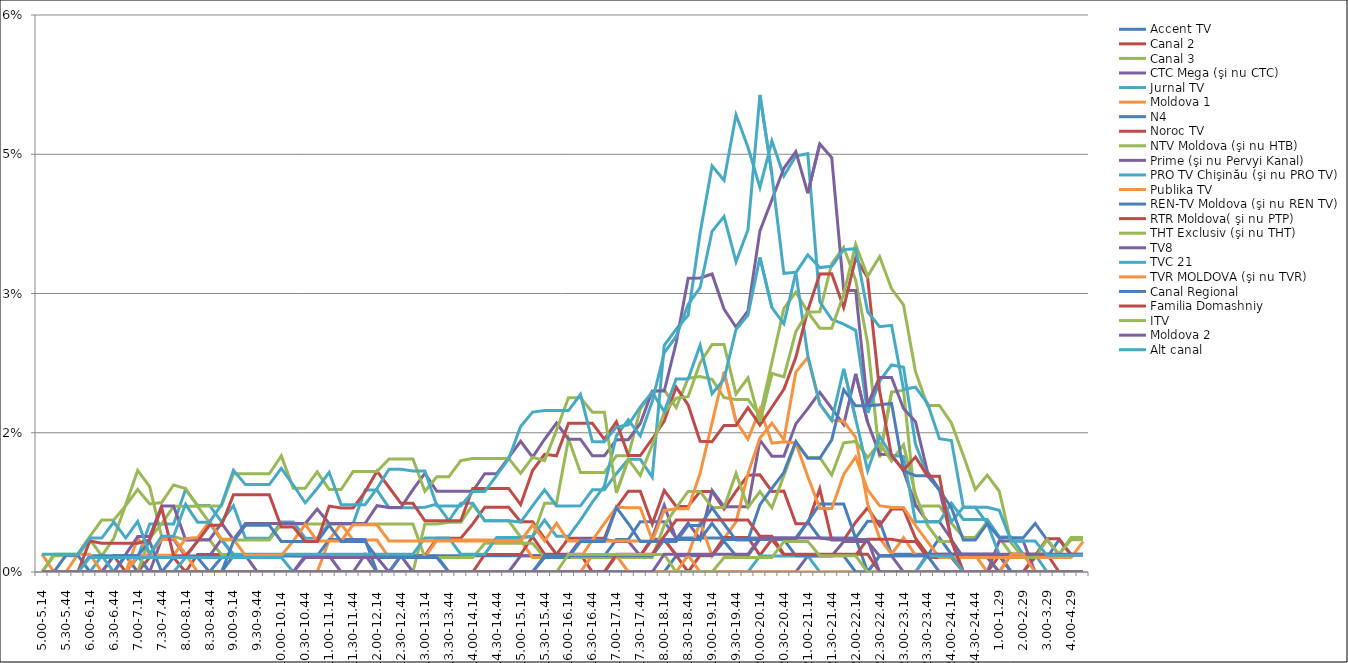
| Category | Accent TV | Canal 2 | Canal 3 | CTC Mega (şi nu CTC) | Jurnal TV | Moldova 1 | N4 | Noroc TV | NTV Moldova (şi nu HTB) | Prime (şi nu Pervyi Kanal) | PRO TV Chişinău (şi nu PRO TV) | Publika TV  | REN-TV Moldova (şi nu REN TV)  | RTR Moldova( şi nu PTP)  | THT Exclusiv (şi nu THT) | TV8 | TVC 21 | TVR MOLDOVA (şi nu TVR) | Canal Regional | Familia Domashniy | ITV | Moldova 2 | Alt canal |
|---|---|---|---|---|---|---|---|---|---|---|---|---|---|---|---|---|---|---|---|---|---|---|---|
| 5.00-5.14 | 0 | 0 | 0 | 0 | 0 | 0 | 0 | 0 | 0 | 0 | 0 | 0.002 | 0 | 0 | 0 | 0 | 0 | 0 | 0 | 0 | 0 | 0 | 0.002 |
| 5.15-5.29 | 0 | 0 | 0.002 | 0 | 0 | 0 | 0 | 0 | 0 | 0 | 0 | 0 | 0 | 0 | 0.002 | 0 | 0 | 0 | 0 | 0 | 0 | 0 | 0.002 |
| 5.30-5.44 | 0 | 0 | 0.002 | 0 | 0 | 0 | 0 | 0 | 0 | 0 | 0 | 0 | 0.002 | 0 | 0.002 | 0 | 0 | 0 | 0 | 0 | 0 | 0 | 0.002 |
| 5.45-5.59 | 0 | 0 | 0.002 | 0 | 0 | 0 | 0 | 0 | 0 | 0 | 0 | 0.002 | 0.002 | 0 | 0.002 | 0 | 0 | 0 | 0 | 0 | 0 | 0 | 0.002 |
| 6.00-6.14 | 0 | 0 | 0.003 | 0 | 0 | 0 | 0.002 | 0 | 0 | 0 | 0 | 0.002 | 0 | 0.003 | 0.004 | 0 | 0.002 | 0 | 0 | 0 | 0 | 0 | 0.004 |
| 6.15-6.29 | 0 | 0 | 0.002 | 0 | 0.002 | 0 | 0.002 | 0 | 0 | 0 | 0 | 0 | 0 | 0.003 | 0.006 | 0 | 0.002 | 0 | 0 | 0 | 0 | 0 | 0.004 |
| 6.30-6.44 | 0 | 0.002 | 0.004 | 0.002 | 0 | 0 | 0.002 | 0 | 0 | 0 | 0 | 0 | 0 | 0.003 | 0.006 | 0 | 0.002 | 0 | 0 | 0 | 0 | 0 | 0.005 |
| 6.45-6.59 | 0 | 0 | 0.007 | 0.002 | 0 | 0 | 0.002 | 0 | 0 | 0.002 | 0 | 0 | 0.002 | 0.003 | 0.007 | 0 | 0.002 | 0 | 0 | 0 | 0 | 0 | 0.004 |
| 7.00-7.14 | 0 | 0 | 0.011 | 0 | 0.002 | 0.004 | 0.002 | 0 | 0 | 0.004 | 0 | 0.002 | 0.002 | 0.003 | 0.009 | 0 | 0.002 | 0 | 0 | 0 | 0 | 0 | 0.005 |
| 7.15-7.29 | 0 | 0.002 | 0.009 | 0 | 0.005 | 0.002 | 0 | 0 | 0.004 | 0.004 | 0 | 0.002 | 0.003 | 0.003 | 0.007 | 0 | 0.002 | 0 | 0 | 0 | 0 | 0 | 0.002 |
| 7.30-7.44 | 0 | 0.002 | 0.004 | 0.004 | 0.005 | 0.003 | 0 | 0 | 0.005 | 0.007 | 0 | 0.002 | 0 | 0.007 | 0.007 | 0 | 0.002 | 0 | 0 | 0 | 0 | 0 | 0.004 |
| 7.45-7.59 | 0 | 0.002 | 0.004 | 0.004 | 0.005 | 0.004 | 0 | 0 | 0.007 | 0.007 | 0 | 0.002 | 0.002 | 0.002 | 0.009 | 0 | 0.002 | 0 | 0 | 0 | 0 | 0 | 0.004 |
| 8.00-8.14 | 0 | 0 | 0.003 | 0.002 | 0.009 | 0.002 | 0 | 0 | 0.007 | 0.003 | 0.002 | 0.004 | 0.002 | 0.002 | 0.009 | 0 | 0.002 | 0 | 0 | 0 | 0 | 0 | 0.007 |
| 8.15-8.29 | 0 | 0.002 | 0.003 | 0.002 | 0.007 | 0 | 0 | 0 | 0.007 | 0.003 | 0.003 | 0.004 | 0.002 | 0.003 | 0.007 | 0 | 0.002 | 0 | 0 | 0 | 0 | 0 | 0.005 |
| 8.30-8.44 | 0 | 0.002 | 0.003 | 0.002 | 0.007 | 0 | 0 | 0 | 0.005 | 0.003 | 0.005 | 0.005 | 0 | 0.005 | 0.007 | 0 | 0.002 | 0 | 0 | 0 | 0 | 0 | 0.005 |
| 8.45-8.59 | 0 | 0.002 | 0.002 | 0.004 | 0.005 | 0 | 0.002 | 0 | 0.003 | 0.005 | 0.003 | 0.004 | 0 | 0.005 | 0.007 | 0 | 0.002 | 0 | 0 | 0 | 0 | 0 | 0.007 |
| 9.00-9.14 | 0.002 | 0.002 | 0.002 | 0.002 | 0.007 | 0 | 0.002 | 0 | 0.003 | 0.003 | 0.002 | 0.004 | 0.003 | 0.008 | 0.011 | 0 | 0.002 | 0 | 0 | 0 | 0 | 0 | 0.011 |
| 9.15-9.29 | 0.002 | 0.002 | 0.002 | 0.002 | 0.004 | 0 | 0.002 | 0 | 0.003 | 0.005 | 0.002 | 0.002 | 0.005 | 0.008 | 0.011 | 0 | 0.002 | 0 | 0 | 0 | 0 | 0 | 0.009 |
| 9.30-9.44 | 0.002 | 0.002 | 0.002 | 0 | 0.004 | 0 | 0.002 | 0 | 0.003 | 0.005 | 0.002 | 0.002 | 0.005 | 0.008 | 0.011 | 0 | 0.002 | 0 | 0 | 0 | 0 | 0 | 0.009 |
| 9.45-9.59 | 0.002 | 0.002 | 0.002 | 0 | 0.004 | 0 | 0.002 | 0 | 0.003 | 0.005 | 0.002 | 0.002 | 0.005 | 0.008 | 0.011 | 0 | 0.002 | 0 | 0 | 0 | 0 | 0 | 0.009 |
| 10.00-10.14 | 0.002 | 0.002 | 0.002 | 0 | 0.005 | 0 | 0.002 | 0 | 0.005 | 0.005 | 0.002 | 0.002 | 0.003 | 0.005 | 0.013 | 0 | 0.002 | 0 | 0 | 0 | 0 | 0 | 0.011 |
| 10.15-10.29 | 0.002 | 0.002 | 0.002 | 0 | 0.005 | 0 | 0.002 | 0 | 0.005 | 0.005 | 0.002 | 0.003 | 0.003 | 0.005 | 0.009 | 0 | 0 | 0 | 0 | 0 | 0 | 0 | 0.009 |
| 10.30-10.44 | 0.002 | 0.002 | 0.002 | 0.002 | 0.004 | 0 | 0.002 | 0 | 0.005 | 0.005 | 0.002 | 0.005 | 0.003 | 0.003 | 0.009 | 0.002 | 0 | 0 | 0 | 0 | 0 | 0 | 0.007 |
| 10.45-10.59 | 0.002 | 0.002 | 0.002 | 0.002 | 0.004 | 0 | 0.002 | 0 | 0.005 | 0.007 | 0.002 | 0.003 | 0.003 | 0.003 | 0.011 | 0.002 | 0 | 0 | 0 | 0 | 0 | 0 | 0.009 |
| 11.00-11.14 | 0.002 | 0.002 | 0.002 | 0.002 | 0.005 | 0.003 | 0.003 | 0 | 0.005 | 0.005 | 0.002 | 0.003 | 0.005 | 0.007 | 0.009 | 0.002 | 0 | 0 | 0 | 0 | 0 | 0 | 0.011 |
| 11.15-11.29 | 0.002 | 0.002 | 0.002 | 0 | 0.005 | 0.005 | 0.003 | 0 | 0.005 | 0.005 | 0.002 | 0.003 | 0.003 | 0.007 | 0.009 | 0.002 | 0 | 0 | 0 | 0 | 0 | 0 | 0.007 |
| 11.30-11.44 | 0.002 | 0.002 | 0.002 | 0 | 0.005 | 0.003 | 0.003 | 0 | 0.005 | 0.005 | 0.002 | 0.005 | 0.003 | 0.007 | 0.011 | 0.002 | 0 | 0 | 0 | 0 | 0 | 0 | 0.007 |
| 11.45-11.59 | 0.002 | 0.002 | 0.002 | 0.002 | 0.009 | 0.003 | 0.003 | 0 | 0.005 | 0.005 | 0.002 | 0.005 | 0.003 | 0.009 | 0.011 | 0.002 | 0 | 0 | 0 | 0 | 0 | 0 | 0.007 |
| 12.00-12.14 | 0.002 | 0.002 | 0 | 0 | 0.009 | 0.003 | 0 | 0 | 0.005 | 0.007 | 0.002 | 0.005 | 0.002 | 0.011 | 0.011 | 0.002 | 0 | 0 | 0 | 0 | 0 | 0 | 0.009 |
| 12.15-12.29 | 0.002 | 0.002 | 0 | 0 | 0.007 | 0.002 | 0 | 0 | 0.005 | 0.007 | 0.002 | 0.003 | 0.002 | 0.009 | 0.012 | 0 | 0 | 0 | 0 | 0 | 0 | 0 | 0.011 |
| 12.30-12.44 | 0.002 | 0.002 | 0 | 0.002 | 0.007 | 0.002 | 0.002 | 0 | 0.005 | 0.007 | 0.002 | 0.003 | 0.002 | 0.007 | 0.012 | 0 | 0 | 0 | 0 | 0 | 0 | 0 | 0.011 |
| 12.45-12.59 | 0.002 | 0.002 | 0 | 0 | 0.007 | 0.002 | 0.002 | 0 | 0.005 | 0.009 | 0.002 | 0.003 | 0.002 | 0.007 | 0.012 | 0 | 0 | 0 | 0 | 0 | 0 | 0 | 0.011 |
| 13.00-13.14 | 0.002 | 0.002 | 0.005 | 0 | 0.007 | 0.002 | 0.002 | 0 | 0.002 | 0.011 | 0.004 | 0.003 | 0.002 | 0.006 | 0.009 | 0 | 0 | 0 | 0 | 0 | 0 | 0 | 0.011 |
| 13.15-13.29 | 0.002 | 0.004 | 0.005 | 0 | 0.007 | 0.003 | 0.002 | 0 | 0.002 | 0.009 | 0.004 | 0.003 | 0.002 | 0.006 | 0.01 | 0 | 0 | 0 | 0 | 0 | 0 | 0 | 0.007 |
| 13.30-13.44 | 0.002 | 0.004 | 0.005 | 0 | 0.006 | 0.003 | 0 | 0 | 0.002 | 0.009 | 0.004 | 0.003 | 0 | 0.006 | 0.01 | 0 | 0 | 0 | 0 | 0 | 0 | 0 | 0.007 |
| 13.45-13.59 | 0.002 | 0.004 | 0.005 | 0 | 0.007 | 0.003 | 0 | 0 | 0.002 | 0.009 | 0.002 | 0.003 | 0 | 0.006 | 0.012 | 0 | 0 | 0 | 0 | 0 | 0 | 0 | 0.007 |
| 14.00-14.14 | 0.002 | 0.005 | 0.007 | 0 | 0.007 | 0.003 | 0 | 0 | 0.002 | 0.009 | 0.002 | 0.003 | 0 | 0.009 | 0.012 | 0 | 0 | 0 | 0 | 0 | 0 | 0 | 0.009 |
| 14.15-14.29 | 0.002 | 0.007 | 0.006 | 0 | 0.006 | 0.003 | 0 | 0.002 | 0.003 | 0.011 | 0.002 | 0.003 | 0 | 0.009 | 0.012 | 0 | 0 | 0 | 0 | 0 | 0 | 0 | 0.009 |
| 14.30-14.44 | 0.002 | 0.007 | 0.006 | 0 | 0.006 | 0.003 | 0 | 0.002 | 0.003 | 0.011 | 0.004 | 0.003 | 0 | 0.009 | 0.012 | 0 | 0 | 0 | 0 | 0 | 0 | 0 | 0.01 |
| 14.45-14.59 | 0.002 | 0.007 | 0.006 | 0 | 0.006 | 0.003 | 0 | 0.002 | 0.003 | 0.012 | 0.004 | 0.003 | 0 | 0.009 | 0.012 | 0 | 0 | 0 | 0 | 0 | 0 | 0 | 0.012 |
| 15.00-15.14 | 0.002 | 0.005 | 0.004 | 0.002 | 0.005 | 0.003 | 0 | 0.002 | 0.003 | 0.014 | 0.004 | 0.003 | 0 | 0.007 | 0.011 | 0 | 0 | 0 | 0 | 0 | 0 | 0 | 0.016 |
| 15.15-15.29 | 0.002 | 0.005 | 0.004 | 0.002 | 0.007 | 0.002 | 0 | 0.004 | 0.003 | 0.012 | 0.004 | 0.005 | 0 | 0.011 | 0.012 | 0 | 0 | 0 | 0 | 0 | 0 | 0 | 0.017 |
| 15.30-15.44 | 0.002 | 0.004 | 0.007 | 0.002 | 0.009 | 0.002 | 0 | 0.002 | 0.002 | 0.014 | 0.006 | 0.003 | 0.002 | 0.013 | 0.012 | 0 | 0 | 0 | 0.002 | 0 | 0 | 0 | 0.017 |
| 15.45-15.59 | 0.002 | 0.002 | 0.007 | 0.002 | 0.007 | 0.002 | 0 | 0.002 | 0.002 | 0.016 | 0.004 | 0.005 | 0.002 | 0.013 | 0.015 | 0 | 0 | 0 | 0.002 | 0 | 0 | 0 | 0.017 |
| 16.00-16.14 | 0.002 | 0.004 | 0.014 | 0.002 | 0.007 | 0.002 | 0 | 0.002 | 0.002 | 0.014 | 0.004 | 0.003 | 0.002 | 0.016 | 0.019 | 0 | 0 | 0 | 0.002 | 0 | 0.002 | 0 | 0.017 |
| 16.15-16.29 | 0.002 | 0.004 | 0.011 | 0.003 | 0.007 | 0.002 | 0 | 0.002 | 0.002 | 0.014 | 0.006 | 0.003 | 0.003 | 0.016 | 0.019 | 0 | 0 | 0 | 0.002 | 0 | 0.002 | 0 | 0.019 |
| 16.30-16.44 | 0.002 | 0.004 | 0.011 | 0.003 | 0.009 | 0.003 | 0 | 0 | 0.002 | 0.013 | 0.008 | 0.003 | 0.003 | 0.016 | 0.017 | 0 | 0 | 0.002 | 0.002 | 0 | 0.002 | 0 | 0.014 |
| 16.45-16.59 | 0.002 | 0.004 | 0.011 | 0.003 | 0.009 | 0.005 | 0 | 0 | 0.002 | 0.013 | 0.009 | 0.003 | 0.003 | 0.014 | 0.017 | 0 | 0 | 0.002 | 0.002 | 0 | 0.002 | 0 | 0.014 |
| 17.00-17.14 | 0.003 | 0.007 | 0.013 | 0.003 | 0.011 | 0.007 | 0 | 0.002 | 0.002 | 0.014 | 0.015 | 0.003 | 0.007 | 0.016 | 0.009 | 0 | 0 | 0.002 | 0.002 | 0.002 | 0.002 | 0 | 0.016 |
| 17.15-17.29 | 0.003 | 0.009 | 0.013 | 0.003 | 0.012 | 0.007 | 0 | 0.002 | 0.002 | 0.014 | 0.016 | 0.003 | 0.005 | 0.013 | 0.012 | 0 | 0 | 0 | 0.002 | 0.002 | 0.002 | 0 | 0.016 |
| 17.30-17.44 | 0.005 | 0.009 | 0.018 | 0.002 | 0.012 | 0.007 | 0 | 0.002 | 0.002 | 0.016 | 0.015 | 0.003 | 0.003 | 0.013 | 0.01 | 0 | 0 | 0 | 0.002 | 0.002 | 0.002 | 0 | 0.018 |
| 17.45-17.59 | 0.005 | 0.005 | 0.019 | 0.004 | 0.01 | 0.003 | 0 | 0.004 | 0.002 | 0.019 | 0.018 | 0.003 | 0.003 | 0.014 | 0.014 | 0 | 0 | 0 | 0.002 | 0.002 | 0.002 | 0 | 0.019 |
| 18.00-18.14 | 0.005 | 0.009 | 0.02 | 0.007 | 0.024 | 0.003 | 0 | 0.004 | 0.005 | 0.019 | 0.024 | 0.007 | 0.003 | 0.016 | 0.017 | 0 | 0 | 0 | 0.003 | 0.004 | 0.002 | 0.002 | 0.017 |
| 18.15-18.29 | 0.004 | 0.007 | 0.018 | 0.004 | 0.026 | 0.002 | 0.002 | 0.002 | 0.007 | 0.025 | 0.025 | 0.007 | 0.003 | 0.02 | 0.019 | 0 | 0 | 0 | 0.003 | 0.006 | 0 | 0.002 | 0.021 |
| 18.30-18.44 | 0.004 | 0.007 | 0.021 | 0.005 | 0.028 | 0.002 | 0.002 | 0 | 0.009 | 0.032 | 0.029 | 0.007 | 0.005 | 0.018 | 0.019 | 0 | 0 | 0.002 | 0.003 | 0.006 | 0 | 0.002 | 0.021 |
| 18.45-18.59 | 0.004 | 0.009 | 0.021 | 0.004 | 0.037 | 0.005 | 0.002 | 0.002 | 0.009 | 0.032 | 0.031 | 0.011 | 0.005 | 0.014 | 0.023 | 0 | 0 | 0 | 0.003 | 0.006 | 0 | 0.002 | 0.024 |
| 19.00-19.14 | 0.004 | 0.009 | 0.021 | 0.009 | 0.044 | 0.002 | 0.002 | 0.002 | 0.007 | 0.032 | 0.037 | 0.016 | 0.007 | 0.014 | 0.025 | 0 | 0 | 0 | 0.005 | 0.006 | 0 | 0.002 | 0.019 |
| 19.15-19.29 | 0.004 | 0.007 | 0.019 | 0.007 | 0.042 | 0.004 | 0.003 | 0.004 | 0.007 | 0.028 | 0.038 | 0.022 | 0.005 | 0.016 | 0.025 | 0 | 0 | 0 | 0.003 | 0.006 | 0.002 | 0.002 | 0.021 |
| 19.30-19.44 | 0.004 | 0.009 | 0.019 | 0.007 | 0.049 | 0.005 | 0.002 | 0.004 | 0.011 | 0.026 | 0.033 | 0.016 | 0.003 | 0.016 | 0.019 | 0 | 0 | 0 | 0.003 | 0.006 | 0.002 | 0.002 | 0.026 |
| 19.45-19.59 | 0.004 | 0.01 | 0.019 | 0.007 | 0.046 | 0.011 | 0.002 | 0.004 | 0.007 | 0.028 | 0.037 | 0.014 | 0.003 | 0.018 | 0.021 | 0 | 0 | 0 | 0.003 | 0.006 | 0.002 | 0.002 | 0.028 |
| 20.00-20.14 | 0.004 | 0.01 | 0.017 | 0.014 | 0.041 | 0.014 | 0.004 | 0.002 | 0.009 | 0.037 | 0.051 | 0.018 | 0.007 | 0.016 | 0.016 | 0 | 0.002 | 0 | 0.003 | 0.004 | 0.002 | 0.004 | 0.034 |
| 20.15-20.29 | 0.004 | 0.009 | 0.023 | 0.012 | 0.046 | 0.016 | 0.004 | 0.004 | 0.007 | 0.04 | 0.043 | 0.014 | 0.009 | 0.018 | 0.021 | 0 | 0.002 | 0 | 0.003 | 0.004 | 0.002 | 0.004 | 0.028 |
| 20.30-20.44 | 0.004 | 0.009 | 0.028 | 0.012 | 0.043 | 0.014 | 0.004 | 0.002 | 0.01 | 0.043 | 0.032 | 0.014 | 0.011 | 0.02 | 0.021 | 0 | 0.002 | 0 | 0.003 | 0.002 | 0.003 | 0.004 | 0.027 |
| 20.45-20.59 | 0.004 | 0.005 | 0.03 | 0.016 | 0.045 | 0.022 | 0.004 | 0.002 | 0.014 | 0.045 | 0.032 | 0.014 | 0.014 | 0.023 | 0.026 | 0 | 0.002 | 0 | 0.002 | 0.002 | 0.003 | 0.004 | 0.032 |
| 21.00-21.14 | 0.005 | 0.005 | 0.028 | 0.018 | 0.045 | 0.023 | 0.005 | 0.002 | 0.012 | 0.041 | 0.023 | 0.01 | 0.012 | 0.028 | 0.028 | 0.002 | 0.002 | 0 | 0.002 | 0.002 | 0.003 | 0.004 | 0.034 |
| 21.15-21.29 | 0.004 | 0.009 | 0.028 | 0.019 | 0.029 | 0.018 | 0.007 | 0.002 | 0.012 | 0.046 | 0.018 | 0.007 | 0.012 | 0.032 | 0.026 | 0.002 | 0 | 0 | 0.002 | 0.002 | 0.002 | 0.004 | 0.033 |
| 21.30-21.44 | 0.004 | 0.003 | 0.033 | 0.018 | 0.027 | 0.016 | 0.007 | 0.002 | 0.01 | 0.045 | 0.016 | 0.007 | 0.014 | 0.032 | 0.026 | 0.002 | 0 | 0 | 0.002 | 0.002 | 0.002 | 0.003 | 0.033 |
| 21.45-21.59 | 0.004 | 0.003 | 0.035 | 0.016 | 0.027 | 0.016 | 0.007 | 0.002 | 0.014 | 0.03 | 0.022 | 0.011 | 0.02 | 0.028 | 0.03 | 0.003 | 0 | 0 | 0.002 | 0.002 | 0.002 | 0.003 | 0.035 |
| 22.00-22.14 | 0.004 | 0.005 | 0.031 | 0.021 | 0.026 | 0.015 | 0.004 | 0.002 | 0.014 | 0.03 | 0.017 | 0.012 | 0.018 | 0.034 | 0.035 | 0.003 | 0 | 0 | 0 | 0.002 | 0.002 | 0.003 | 0.035 |
| 22.15-22.29 | 0.005 | 0.007 | 0.025 | 0.016 | 0.017 | 0.007 | 0 | 0.004 | 0.012 | 0.018 | 0.011 | 0.009 | 0.018 | 0.032 | 0.032 | 0.003 | 0 | 0 | 0 | 0.002 | 0 | 0.003 | 0.028 |
| 22.30-22.44 | 0.005 | 0.005 | 0.012 | 0.013 | 0.021 | 0.004 | 0.002 | 0.004 | 0.014 | 0.021 | 0.015 | 0.007 | 0.018 | 0.02 | 0.034 | 0.002 | 0 | 0 | 0.002 | 0 | 0 | 0 | 0.026 |
| 22.45-22.59 | 0.002 | 0.007 | 0.019 | 0.013 | 0.022 | 0.002 | 0.002 | 0.004 | 0.012 | 0.021 | 0.013 | 0.007 | 0.018 | 0.013 | 0.03 | 0.002 | 0 | 0 | 0.002 | 0 | 0 | 0 | 0.027 |
| 23.00-23.14 | 0.002 | 0.007 | 0.02 | 0.011 | 0.022 | 0.004 | 0.002 | 0.003 | 0.014 | 0.018 | 0.012 | 0.007 | 0.011 | 0.011 | 0.029 | 0 | 0 | 0 | 0.002 | 0 | 0 | 0 | 0.02 |
| 23.15-23.29 | 0.002 | 0.004 | 0.007 | 0.007 | 0.014 | 0.002 | 0.002 | 0.003 | 0.008 | 0.016 | 0.005 | 0.005 | 0.01 | 0.012 | 0.022 | 0 | 0 | 0 | 0.002 | 0 | 0 | 0 | 0.02 |
| 23.30-23.44 | 0.002 | 0.002 | 0.007 | 0.005 | 0.01 | 0.002 | 0.002 | 0.002 | 0.005 | 0.011 | 0.005 | 0.003 | 0.01 | 0.01 | 0.018 | 0.002 | 0.002 | 0 | 0.002 | 0 | 0 | 0 | 0.018 |
| 23.45-23.59 | 0.002 | 0.002 | 0.007 | 0.005 | 0.009 | 0.002 | 0.004 | 0.002 | 0.003 | 0.009 | 0.005 | 0.002 | 0.009 | 0.01 | 0.018 | 0.002 | 0.002 | 0 | 0 | 0 | 0 | 0 | 0.014 |
| 24.00-24.14 | 0.002 | 0.002 | 0.005 | 0.004 | 0.005 | 0.002 | 0.002 | 0.002 | 0.003 | 0.003 | 0.007 | 0.002 | 0.007 | 0.003 | 0.016 | 0.002 | 0.002 | 0 | 0 | 0 | 0 | 0 | 0.014 |
| 24.15-24.29 | 0.002 | 0 | 0.004 | 0 | 0.007 | 0.002 | 0.002 | 0 | 0.002 | 0.002 | 0.006 | 0.002 | 0.003 | 0 | 0.013 | 0.002 | 0 | 0 | 0 | 0 | 0 | 0 | 0.007 |
| 24.30-24.44 | 0.002 | 0 | 0.004 | 0 | 0.007 | 0.002 | 0.002 | 0 | 0.002 | 0.002 | 0.006 | 0.002 | 0.003 | 0 | 0.009 | 0.002 | 0 | 0 | 0 | 0 | 0 | 0 | 0.007 |
| 24.45-24.59 | 0.002 | 0 | 0.005 | 0 | 0.005 | 0 | 0.002 | 0 | 0.002 | 0.002 | 0.006 | 0.002 | 0.005 | 0 | 0.01 | 0.002 | 0 | 0 | 0 | 0 | 0 | 0 | 0.007 |
| 1.00-1.29 | 0.002 | 0.002 | 0.004 | 0.003 | 0.002 | 0 | 0.002 | 0 | 0 | 0 | 0.004 | 0.002 | 0.004 | 0 | 0.009 | 0.002 | 0 | 0 | 0 | 0 | 0 | 0 | 0.007 |
| 1.30-1. 59 | 0 | 0 | 0.002 | 0.003 | 0.002 | 0 | 0 | 0.002 | 0 | 0 | 0.004 | 0.002 | 0.004 | 0 | 0.003 | 0.002 | 0 | 0.002 | 0 | 0 | 0 | 0 | 0.003 |
| 2.00-2.29 | 0 | 0 | 0.002 | 0.003 | 0.002 | 0 | 0 | 0.002 | 0 | 0 | 0.002 | 0.002 | 0.004 | 0 | 0.002 | 0.002 | 0 | 0.002 | 0 | 0 | 0 | 0 | 0.003 |
| 2.30-2.59 | 0 | 0 | 0.002 | 0 | 0.002 | 0 | 0.002 | 0.002 | 0 | 0 | 0.002 | 0.002 | 0.005 | 0.002 | 0.002 | 0.002 | 0 | 0 | 0 | 0 | 0 | 0 | 0.003 |
| 3.00-3.29 | 0 | 0 | 0.002 | 0 | 0 | 0 | 0.002 | 0.002 | 0 | 0 | 0.002 | 0.002 | 0.003 | 0.004 | 0.003 | 0.002 | 0 | 0 | 0 | 0 | 0 | 0 | 0.002 |
| 3.30-3.59 | 0 | 0 | 0.002 | 0 | 0 | 0 | 0.003 | 0 | 0 | 0 | 0.002 | 0.002 | 0.002 | 0.004 | 0.002 | 0.002 | 0 | 0 | 0 | 0 | 0 | 0 | 0.002 |
| 4.00-4.29 | 0 | 0 | 0.004 | 0 | 0 | 0 | 0.002 | 0 | 0 | 0 | 0.002 | 0.002 | 0.002 | 0.002 | 0.003 | 0.002 | 0 | 0 | 0 | 0 | 0 | 0 | 0.002 |
| 4.30-4.59 | 0 | 0 | 0.004 | 0 | 0 | 0 | 0.002 | 0 | 0 | 0 | 0.002 | 0.003 | 0.002 | 0.002 | 0.003 | 0.002 | 0 | 0 | 0 | 0 | 0 | 0 | 0.002 |